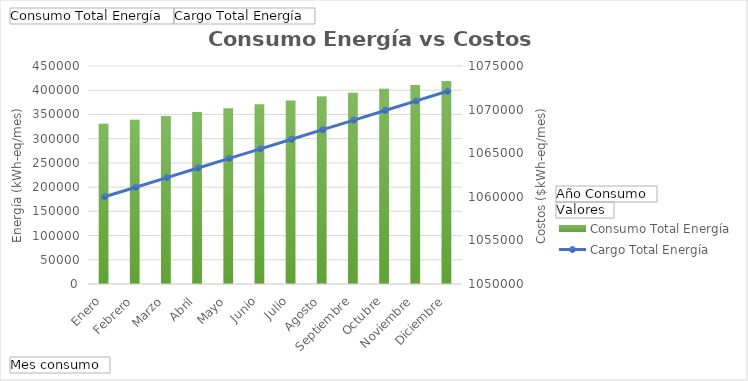
| Category | 2023 - Consumo Total Energía |
|---|---|
| Enero | 331000 |
| Febrero | 339000 |
| Marzo | 347000 |
| Abril | 355000 |
| Mayo | 363000 |
| Junio | 371000 |
| Julio | 379000 |
| Agosto | 387000 |
| Septiembre | 395000 |
| Octubre | 403000 |
| Noviembre | 411000 |
| Diciembre | 419000 |